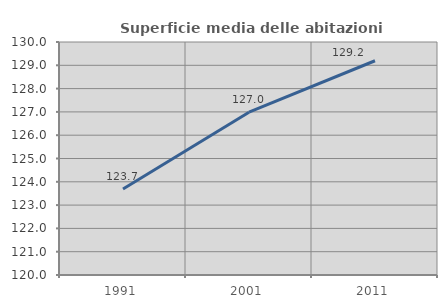
| Category | Superficie media delle abitazioni occupate |
|---|---|
| 1991.0 | 123.691 |
| 2001.0 | 126.986 |
| 2011.0 | 129.195 |